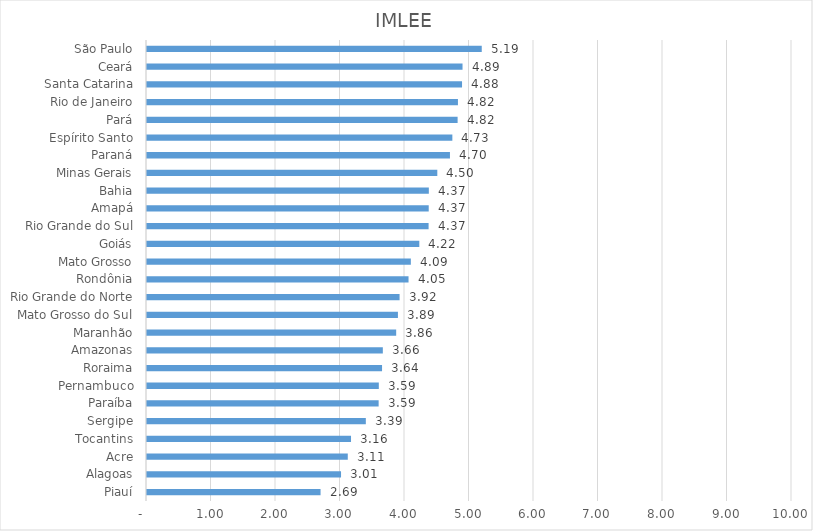
| Category | Series 0 |
|---|---|
| Piauí | 2.691 |
| Alagoas | 3.008 |
| Acre | 3.113 |
| Tocantins | 3.163 |
| Sergipe | 3.393 |
| Paraíba | 3.591 |
| Pernambuco | 3.594 |
| Roraima | 3.644 |
| Amazonas | 3.656 |
| Maranhão | 3.863 |
| Mato Grosso do Sul | 3.89 |
| Rio Grande do Norte | 3.916 |
| Rondônia | 4.055 |
| Mato Grosso | 4.091 |
| Goiás | 4.222 |
| Rio Grande do Sul | 4.366 |
| Amapá | 4.368 |
| Bahia | 4.369 |
| Minas Gerais | 4.501 |
| Paraná | 4.697 |
| Espírito Santo | 4.734 |
| Pará | 4.816 |
| Rio de Janeiro | 4.821 |
| Santa Catarina | 4.884 |
| Ceará | 4.892 |
| São Paulo | 5.19 |